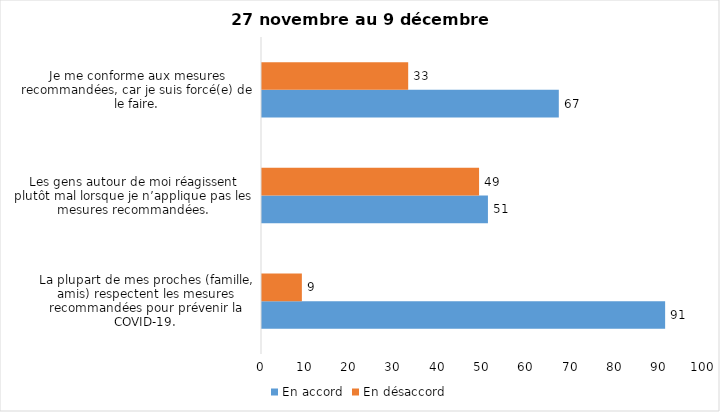
| Category | En accord | En désaccord |
|---|---|---|
| La plupart de mes proches (famille, amis) respectent les mesures recommandées pour prévenir la COVID-19. | 91 | 9 |
| Les gens autour de moi réagissent plutôt mal lorsque je n’applique pas les mesures recommandées. | 51 | 49 |
| Je me conforme aux mesures recommandées, car je suis forcé(e) de le faire. | 67 | 33 |